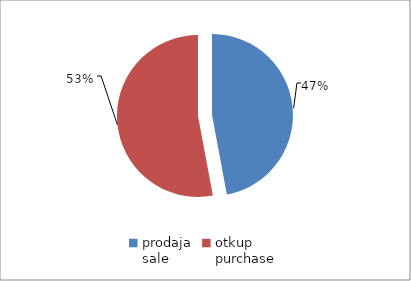
| Category | Series 0 |
|---|---|
| prodaja
sale | 11763042 |
| otkup
purchase | 13231108.74 |